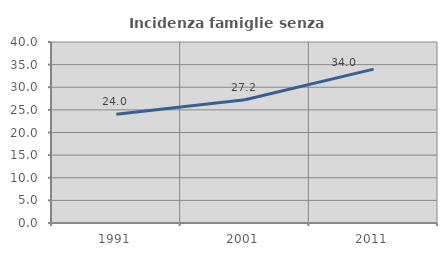
| Category | Incidenza famiglie senza nuclei |
|---|---|
| 1991.0 | 24.022 |
| 2001.0 | 27.241 |
| 2011.0 | 34.014 |